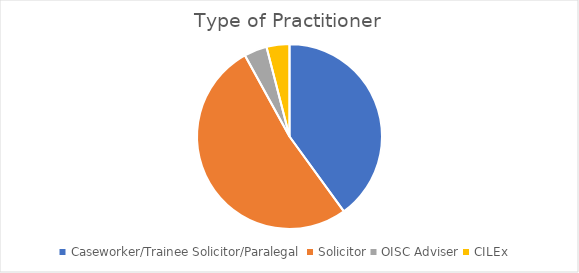
| Category | Number of respondents |
|---|---|
| Caseworker/Trainee Solicitor/Paralegal | 10 |
| Solicitor | 13 |
| OISC Adviser | 1 |
| CILEx | 1 |